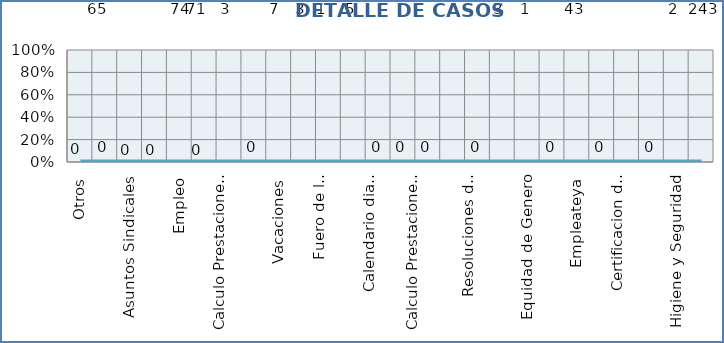
| Category | Series 0 |
|---|---|
| Otros | 0 |
| Sirla/SuirPlus | 0 |
| Asuntos Sindicales | 0 |
| Informacion Publica | 0 |
| Empleo | 0 |
| Inspección | 0 |
| Calculo Prestaciones Laborales | 0 |
| Salario de Navidad | 0 |
| Vacaciones | 0 |
| Quejas y Denuncias | 0 |
| Fuero de la Maternidad | 0 |
| Empleados Domesticos | 0 |
| Calendario dias Feriados" | 0 |
| Licencia | 0 |
| Calculo Prestaciones Laborales por quiebra empresa | 0 |
| Calculo Prestaciones Laborales por renuncia | 0 |
| Resoluciones de Salarios | 0 |
| Salario | 0 |
| Equidad de Genero | 0 |
| Calendario dias Feriados | 0 |
| Empleateya | 0 |
| Prestaciones laborales por venta empresa | 0 |
| Certificacion de Trabajo | 0 |
| Gestion Humana | 0 |
| Higiene y Seguridad | 0 |